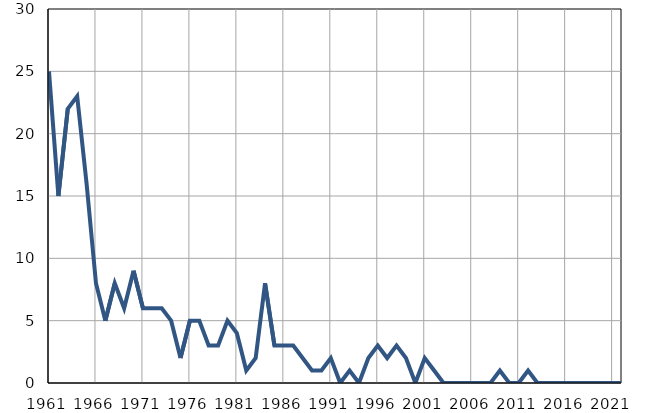
| Category | Умрла 
одојчад |
|---|---|
| 1961.0 | 25 |
| 1962.0 | 15 |
| 1963.0 | 22 |
| 1964.0 | 23 |
| 1965.0 | 16 |
| 1966.0 | 8 |
| 1967.0 | 5 |
| 1968.0 | 8 |
| 1969.0 | 6 |
| 1970.0 | 9 |
| 1971.0 | 6 |
| 1972.0 | 6 |
| 1973.0 | 6 |
| 1974.0 | 5 |
| 1975.0 | 2 |
| 1976.0 | 5 |
| 1977.0 | 5 |
| 1978.0 | 3 |
| 1979.0 | 3 |
| 1980.0 | 5 |
| 1981.0 | 4 |
| 1982.0 | 1 |
| 1983.0 | 2 |
| 1984.0 | 8 |
| 1985.0 | 3 |
| 1986.0 | 3 |
| 1987.0 | 3 |
| 1988.0 | 2 |
| 1989.0 | 1 |
| 1990.0 | 1 |
| 1991.0 | 2 |
| 1992.0 | 0 |
| 1993.0 | 1 |
| 1994.0 | 0 |
| 1995.0 | 2 |
| 1996.0 | 3 |
| 1997.0 | 2 |
| 1998.0 | 3 |
| 1999.0 | 2 |
| 2000.0 | 0 |
| 2001.0 | 2 |
| 2002.0 | 1 |
| 2003.0 | 0 |
| 2004.0 | 0 |
| 2005.0 | 0 |
| 2006.0 | 0 |
| 2007.0 | 0 |
| 2008.0 | 0 |
| 2009.0 | 1 |
| 2010.0 | 0 |
| 2011.0 | 0 |
| 2012.0 | 1 |
| 2013.0 | 0 |
| 2014.0 | 0 |
| 2015.0 | 0 |
| 2016.0 | 0 |
| 2017.0 | 0 |
| 2018.0 | 0 |
| 2019.0 | 0 |
| 2020.0 | 0 |
| 2021.0 | 0 |
| 2022.0 | 0 |